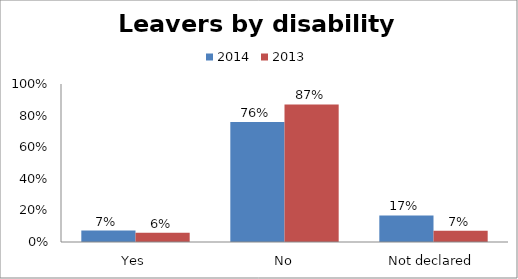
| Category | 2014 | 2013 |
|---|---|---|
| Yes | 0.073 | 0.059 |
| No | 0.759 | 0.871 |
| Not declared | 0.168 | 0.071 |